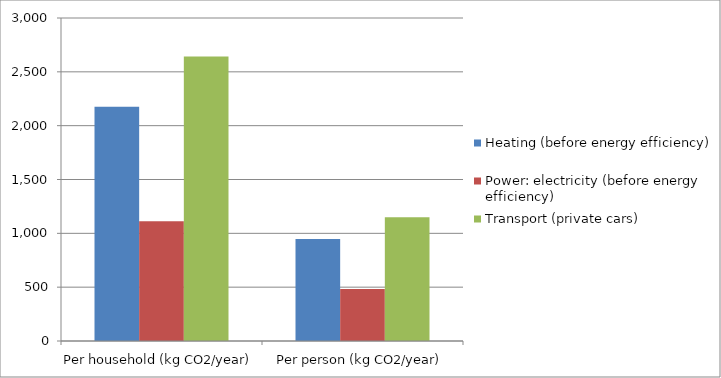
| Category | Heating (before energy efficiency) | Power: electricity (before energy efficiency) | Transport (private cars) |
|---|---|---|---|
| Per household (kg CO2/year) | 2176.743 | 1113.043 | 2642.03 |
| Per person (kg CO2/year) | 946.41 | 483.932 | 1148.709 |